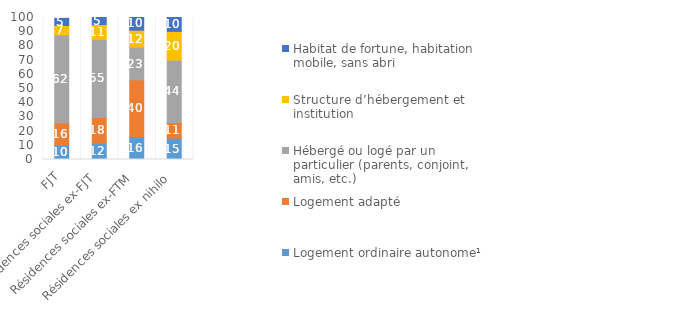
| Category | Logement ordinaire autonome¹ | Logement adapté | Hébergé ou logé par un particulier (parents, conjoint, amis, etc.)  | Structure d’hébergement et institution | Habitat de fortune, habitation mobile, sans abri |
|---|---|---|---|---|---|
| FJT | 9.864 | 16 | 61.866 | 6.668 | 5.011 |
| Résidences sociales ex-FJT | 11.569 | 18 | 55 | 10.509 | 5 |
| Résidences sociales ex-FTM | 16.077 | 40 | 23 | 12 | 10 |
| Résidences sociales ex nihilo | 15 | 11 | 44 | 20.222 | 10 |